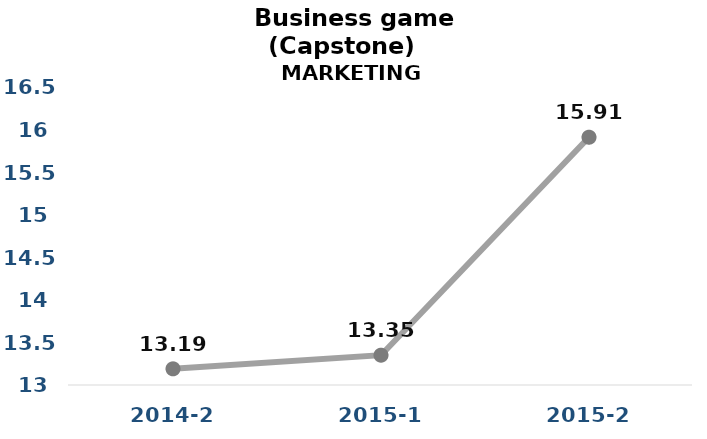
| Category | Series 0 |
|---|---|
| 2014-2 | 13.19 |
| 2015-1 | 13.35 |
| 2015-2 | 15.91 |